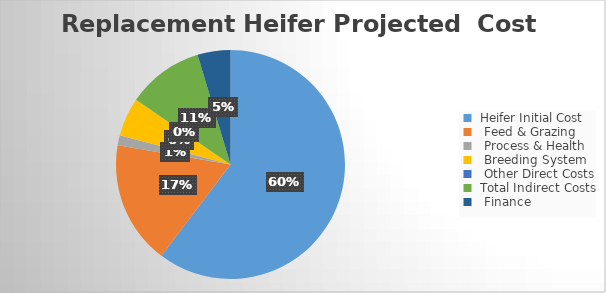
| Category | Series 0 |
|---|---|
|  Heifer Initial Cost | 850 |
|   Feed & Grazing  | 245.1 |
|   Process & Health | 20 |
|   Breeding System  | 76.8 |
|   Other Direct Costs | 0 |
|  Total Indirect Costs | 152.152 |
|   Finance | 65.532 |